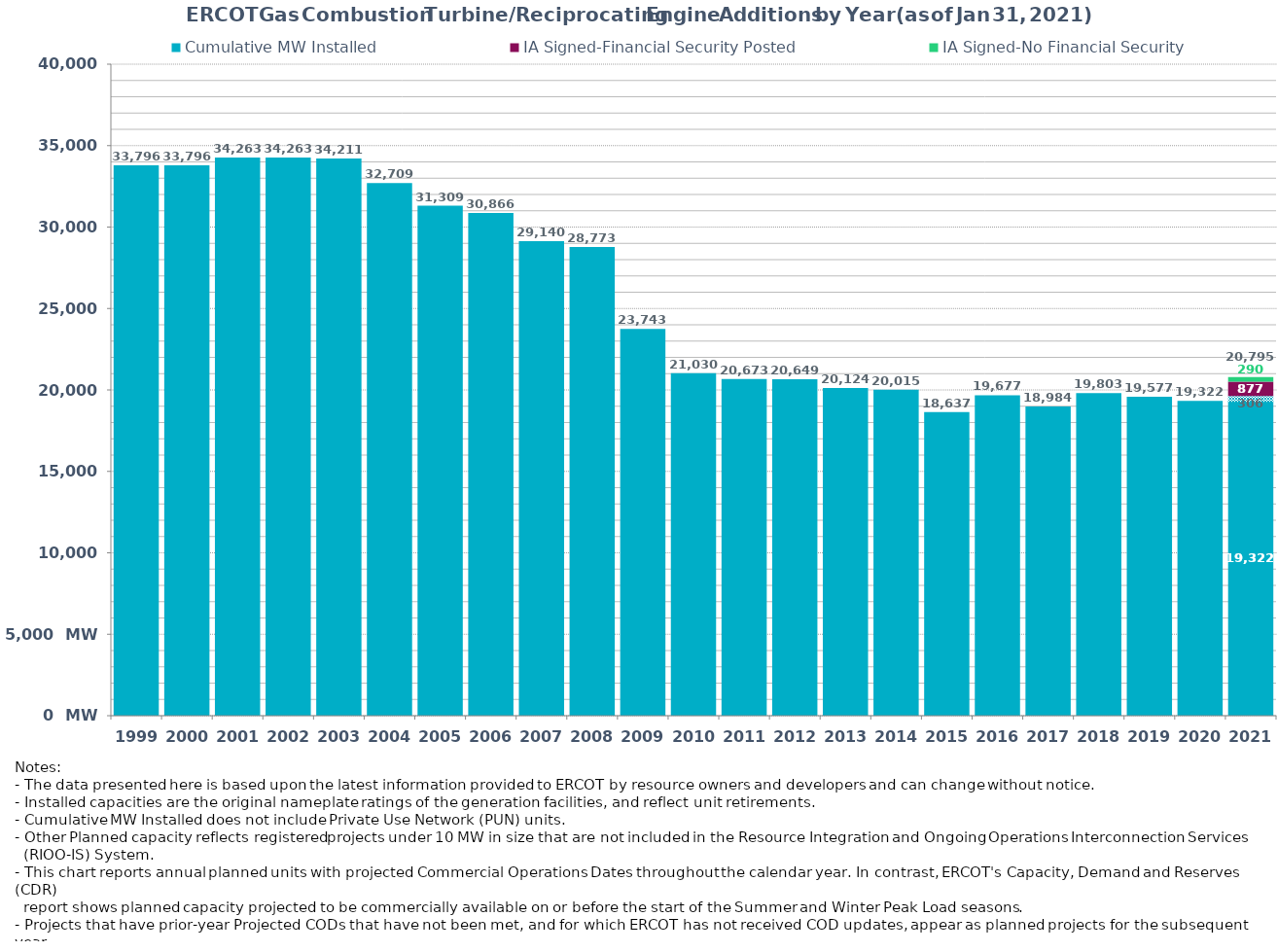
| Category | Cumulative MW Installed | Cumulative MW Synchronized | IA Signed-Financial Security Posted  | IA Signed-No Financial Security  | Other Planned | Cumulative Installed and Planned |
|---|---|---|---|---|---|---|
| 1999.0 | 33796.03 | 0 | 0 | 0 | 0 | 33796.03 |
| 2000.0 | 33796.03 | 0 | 0 | 0 | 0 | 33796.03 |
| 2001.0 | 34262.59 | 0 | 0 | 0 | 0 | 34262.59 |
| 2002.0 | 34262.59 | 0 | 0 | 0 | 0 | 34262.59 |
| 2003.0 | 34210.59 | 0 | 0 | 0 | 0 | 34210.59 |
| 2004.0 | 32708.69 | 0 | 0 | 0 | 0 | 32708.69 |
| 2005.0 | 31309.49 | 0 | 0 | 0 | 0 | 31309.49 |
| 2006.0 | 30866.49 | 0 | 0 | 0 | 0 | 30866.49 |
| 2007.0 | 29140.49 | 0 | 0 | 0 | 0 | 29140.49 |
| 2008.0 | 28773.29 | 0 | 0 | 0 | 0 | 28773.29 |
| 2009.0 | 23743.29 | 0 | 0 | 0 | 0 | 23743.29 |
| 2010.0 | 21030.17 | 0 | 0 | 0 | 0 | 21030.17 |
| 2011.0 | 20673.47 | 0 | 0 | 0 | 0 | 20673.47 |
| 2012.0 | 20649.47 | 0 | 0 | 0 | 0 | 20649.47 |
| 2013.0 | 20124.47 | 0 | 0 | 0 | 0 | 20124.47 |
| 2014.0 | 20015.47 | 0 | 0 | 0 | 0 | 20015.47 |
| 2015.0 | 18636.67 | 0 | 0 | 0 | 0 | 18636.67 |
| 2016.0 | 19677.05 | 0 | 0 | 0 | 0 | 19677.05 |
| 2017.0 | 18984.19 | 0 | 0 | 0 | 0 | 18984.19 |
| 2018.0 | 19803.35 | 0 | 0 | 0 | 0 | 19803.35 |
| 2019.0 | 19577.05 | 0 | 0 | 0 | 0 | 19577.05 |
| 2020.0 | 19322.4 | 0 | 0 | 0 | 0 | 19322.4 |
| 2021.0 | 19322.14 | 306 | 877 | 290 | 0 | 20795.14 |